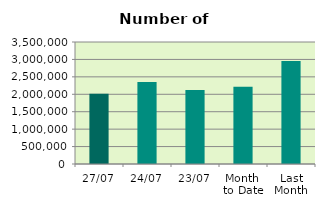
| Category | Series 0 |
|---|---|
| 27/07 | 2012448 |
| 24/07 | 2354334 |
| 23/07 | 2120686 |
| Month 
to Date | 2214812.842 |
| Last
Month | 2956123.091 |